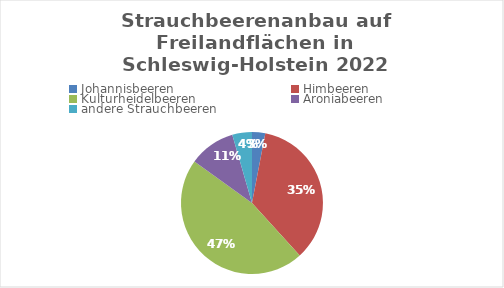
| Category | Series 0 |
|---|---|
| Johannisbeeren | 4.92 |
| Himbeeren | 57.6 |
| Kulturheidelbeeren | 76.28 |
| Aroniabeeren | 17.27 |
| andere Strauchbeeren | 7.32 |